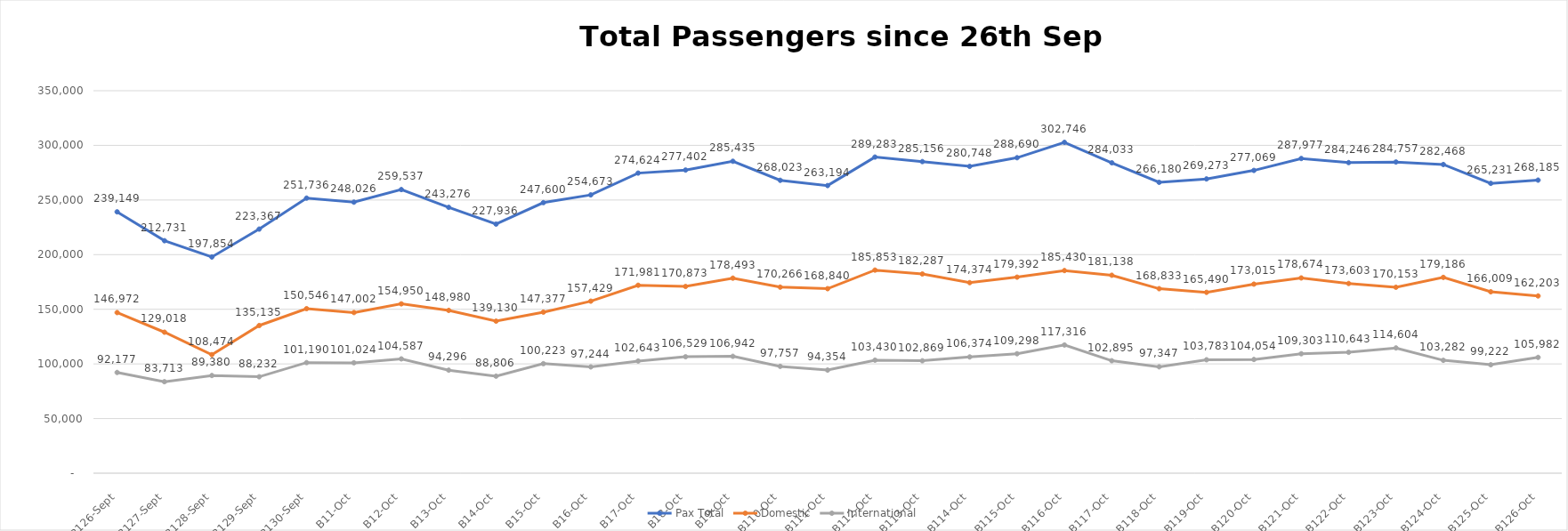
| Category | Pax Total |  Domestic  |  International  |
|---|---|---|---|
| 2022-09-26 | 239149 | 146972 | 92177 |
| 2022-09-27 | 212731 | 129018 | 83713 |
| 2022-09-28 | 197854 | 108474 | 89380 |
| 2022-09-29 | 223367 | 135135 | 88232 |
| 2022-09-30 | 251736 | 150546 | 101190 |
| 2022-10-01 | 248026 | 147002 | 101024 |
| 2022-10-02 | 259537 | 154950 | 104587 |
| 2022-10-03 | 243276 | 148980 | 94296 |
| 2022-10-04 | 227936 | 139130 | 88806 |
| 2022-10-05 | 247600 | 147377 | 100223 |
| 2022-10-06 | 254673 | 157429 | 97244 |
| 2022-10-07 | 274624 | 171981 | 102643 |
| 2022-10-08 | 277402 | 170873 | 106529 |
| 2022-10-09 | 285435 | 178493 | 106942 |
| 2022-10-10 | 268023 | 170266 | 97757 |
| 2022-10-11 | 263194 | 168840 | 94354 |
| 2022-10-12 | 289283 | 185853 | 103430 |
| 2022-10-13 | 285156 | 182287 | 102869 |
| 2022-10-14 | 280748 | 174374 | 106374 |
| 2022-10-15 | 288690 | 179392 | 109298 |
| 2022-10-16 | 302746 | 185430 | 117316 |
| 2022-10-17 | 284033 | 181138 | 102895 |
| 2022-10-18 | 266180 | 168833 | 97347 |
| 2022-10-19 | 269273 | 165490 | 103783 |
| 2022-10-20 | 277069 | 173015 | 104054 |
| 2022-10-21 | 287977 | 178674 | 109303 |
| 2022-10-22 | 284246 | 173603 | 110643 |
| 2022-10-23 | 284757 | 170153 | 114604 |
| 2022-10-24 | 282468 | 179186 | 103282 |
| 2022-10-25 | 265231 | 166009 | 99222 |
| 2022-10-26 | 268185 | 162203 | 105982 |